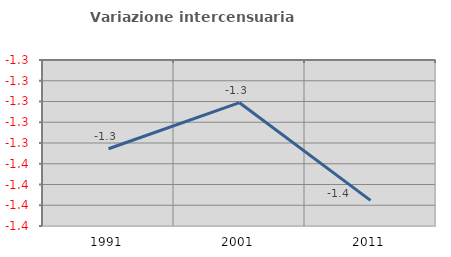
| Category | Variazione intercensuaria annua |
|---|---|
| 1991.0 | -1.346 |
| 2001.0 | -1.301 |
| 2011.0 | -1.395 |